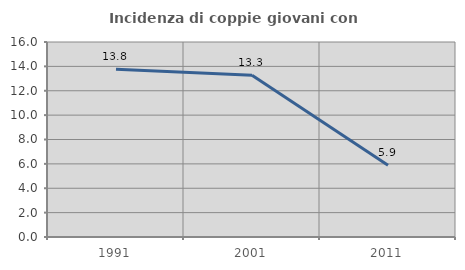
| Category | Incidenza di coppie giovani con figli |
|---|---|
| 1991.0 | 13.765 |
| 2001.0 | 13.269 |
| 2011.0 | 5.882 |